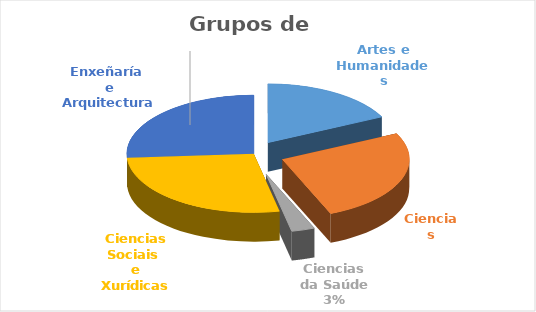
| Category | nº de grupos de investigación |
|---|---|
| Artes e Humanidades | 30 |
| Ciencias | 44 |
| Ciencias da Saúde | 5 |
| Ciencias Sociais 
e Xurídicas | 46 |
| Enxeñaría 
e Arquitectura | 44 |